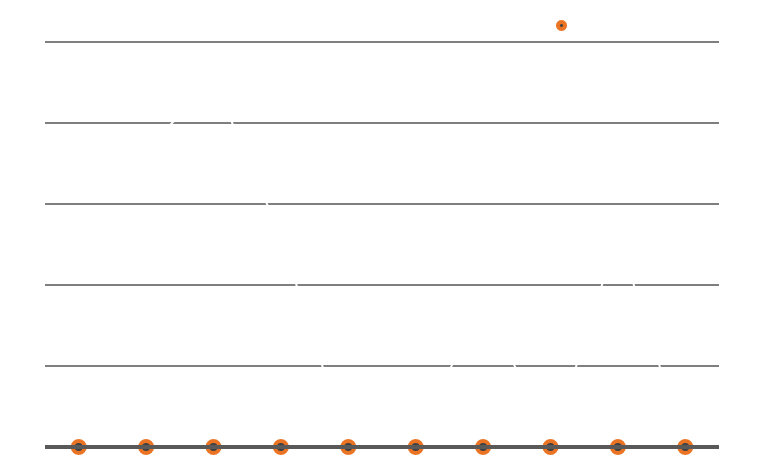
| Category | prevoženih kilometrov |
|---|---|
| 5/1/12 | 162 |
| 5/2/12 | 183 |
| 5/3/12 | 227 |
| 5/4/12 | 130 |
| 5/5/12 | 0 |
| 5/6/12 | 0 |
| 5/7/12 | 94 |
| 5/8/12 | 0 |
| 5/9/12 | 131 |
| 5/10/12 | 0 |